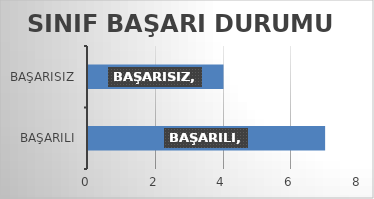
| Category | Series 0 |
|---|---|
| BAŞARILI | 7 |
| BAŞARISIZ | 4 |